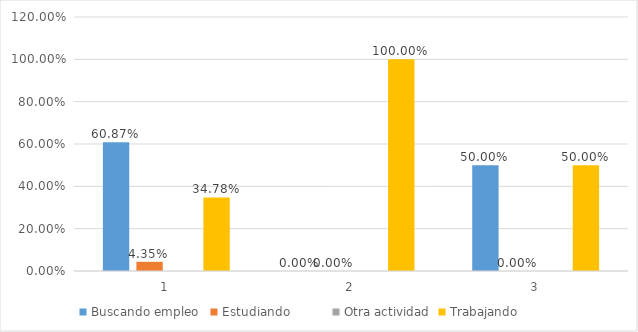
| Category | Buscando empleo  | Estudiando          | Otra actividad | Trabajando          |
|---|---|---|---|---|
| 0 | 0.609 | 0.043 | 0 | 0.348 |
| 1 | 0 | 0 | 0 | 1 |
| 2 | 0.5 | 0 | 0 | 0.5 |